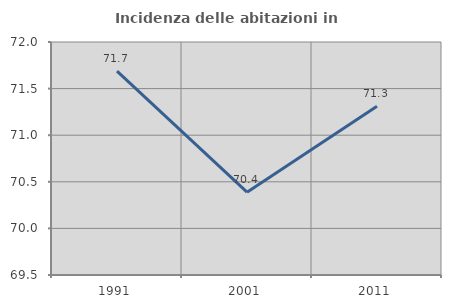
| Category | Incidenza delle abitazioni in proprietà  |
|---|---|
| 1991.0 | 71.688 |
| 2001.0 | 70.389 |
| 2011.0 | 71.31 |